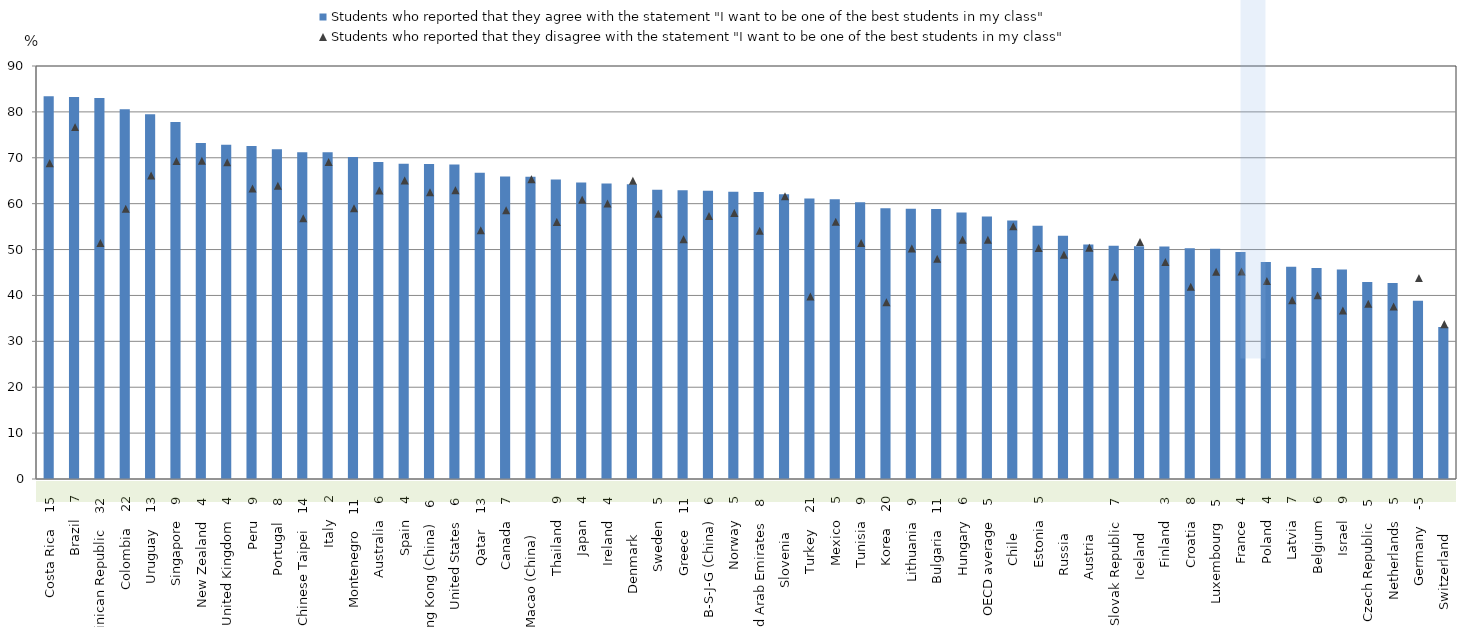
| Category | Students who reported that they agree with the statement "I want to be one of the best students in my class" |
|---|---|
| Costa Rica    15 | 83.381 |
| Brazil    7 | 83.228 |
| Dominican Republic    32 | 83.05 |
| Colombia    22 | 80.593 |
| Uruguay    13 | 79.482 |
| Singapore    9 | 77.8 |
| New Zealand    4 | 73.23 |
| United Kingdom    4 | 72.857 |
| Peru    9 | 72.573 |
| Portugal    8 | 71.841 |
| Chinese Taipei    14 | 71.205 |
| Italy    2 | 71.192 |
| Montenegro    11 | 70.158 |
| Australia    6 | 69.059 |
| Spain    4 | 68.678 |
| Hong Kong (China)    6 | 68.627 |
| United States    6 | 68.554 |
| Qatar    13 | 66.713 |
| Canada    7 | 65.935 |
| Macao (China)          | 65.885 |
| Thailand    9 | 65.256 |
| Japan    4 | 64.637 |
| Ireland    4 | 64.385 |
| Denmark          | 64.22 |
| Sweden    5 | 63.034 |
| Greece    11 | 62.929 |
| B-S-J-G (China)    6 | 62.83 |
| Norway    5 | 62.588 |
| United Arab Emirates    8 | 62.544 |
| Slovenia          | 62.049 |
| Turkey    21 | 61.101 |
| Mexico    5 | 60.942 |
| Tunisia    9 | 60.289 |
| Korea    20 | 58.988 |
| Lithuania    9 | 58.888 |
| Bulgaria    11 | 58.835 |
| Hungary    6 | 58.098 |
| OECD average    5 | 57.189 |
| Chile          | 56.351 |
| Estonia    5 | 55.183 |
| Russia          | 53.018 |
| Austria          | 51.112 |
| Slovak Republic    7 | 50.803 |
| Iceland          | 50.741 |
| Finland    3 | 50.65 |
| Croatia    8 | 50.307 |
| Luxembourg    5 | 50.154 |
| France    4 | 49.452 |
| Poland    4 | 47.3 |
| Latvia    7 | 46.264 |
| Belgium    6 | 45.971 |
| Israel    9 | 45.677 |
| Czech Republic    5 | 42.954 |
| Netherlands    5 | 42.724 |
| Germany    -5 | 38.843 |
| Switzerland          | 33.133 |